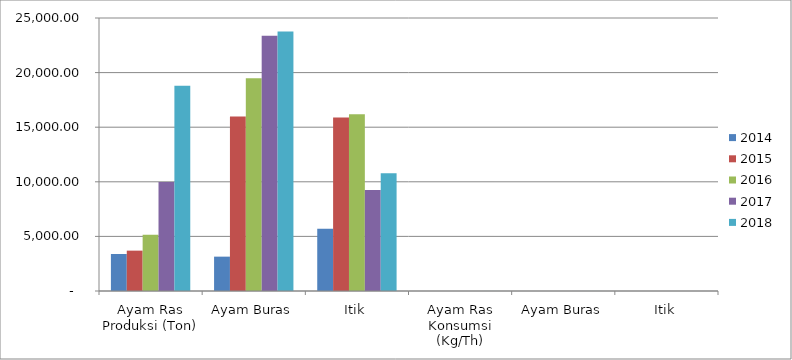
| Category | 2014 | 2015 | 2016 | 2017 | 2018 |
|---|---|---|---|---|---|
| 0 | 3390.83 | 3696.26 | 5162.39 | 9992.63 | 18795 |
| 1 | 3146.16 | 15969.43 | 19493.52 | 23382.45 | 23770.94 |
| 2 | 5690.72 | 15897.74 | 16178.4 | 9255.94 | 10775.48 |
| 3 | 1.12 | 1.44 | 1.48 | 2.43 | 4.02 |
| 4 | 0.44 | 2.17 | 2.65 | 3.12 | 3.09 |
| 5 | 0.94 | 2.53 | 2.58 | 1.45 | 1.64 |